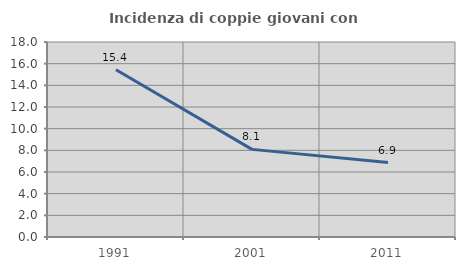
| Category | Incidenza di coppie giovani con figli |
|---|---|
| 1991.0 | 15.441 |
| 2001.0 | 8.088 |
| 2011.0 | 6.87 |